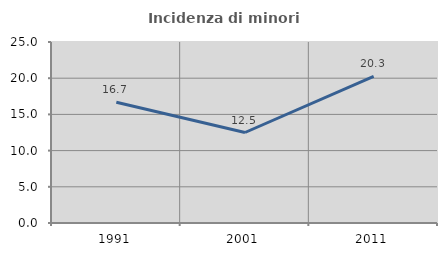
| Category | Incidenza di minori stranieri |
|---|---|
| 1991.0 | 16.667 |
| 2001.0 | 12.5 |
| 2011.0 | 20.264 |